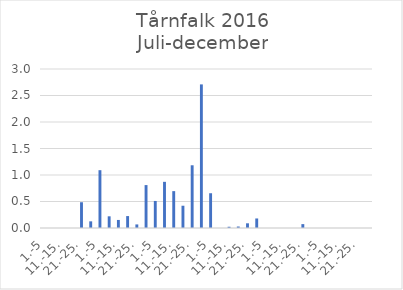
| Category | Series 0 |
|---|---|
| 1.-5 | 0 |
| 6.-10. | 0 |
| 11.-15. | 0 |
| 16.-20. | 0 |
| 21.-25. | 0.486 |
| 26.-31. | 0.126 |
| 1.-5 | 1.091 |
| 6.-10. | 0.221 |
| 11.-15. | 0.152 |
| 16.-20. | 0.225 |
| 21.-25. | 0.067 |
| 26.-31. | 0.81 |
| 1.-5 | 0.51 |
| 6.-10. | 0.871 |
| 11.-15. | 0.696 |
| 16.-20. | 0.42 |
| 21.-25. | 1.183 |
| 26.-30. | 2.71 |
| 1.-5 | 0.656 |
| 6.-10. | 0 |
| 11.-15. | 0.024 |
| 16.-20. | 0.028 |
| 21.-25. | 0.089 |
| 26.-31. | 0.18 |
| 1.-5 | 0 |
| 6.-10. | 0 |
| 11.-15. | 0 |
| 16.-20. | 0 |
| 21.-25. | 0.073 |
| 26.-30. | 0 |
| 1.-5 | 0 |
| 6.-10. | 0 |
| 11.-15. | 0 |
| 16.-20. | 0 |
| 21.-25. | 0 |
| 26.-31. | 0 |